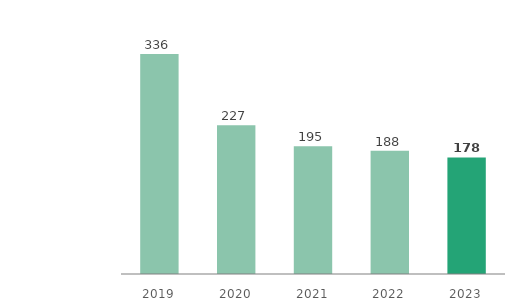
| Category | Assets in Kazakhstan |
|---|---|
| 2019.0 | 336 |
| 2020.0 | 227 |
| 2021.0 | 195 |
| 2022.0 | 188 |
| 2023.0 | 178 |